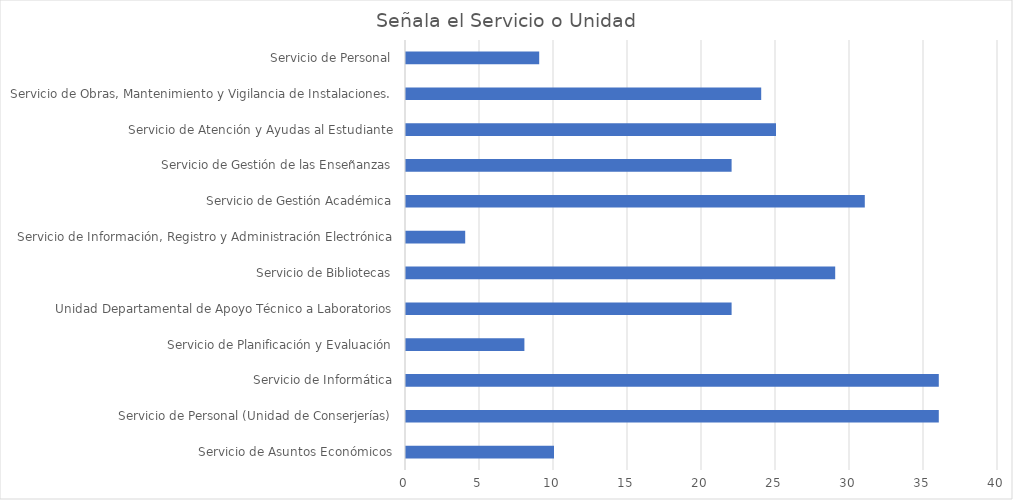
| Category | Series 4 |
|---|---|
| Servicio de Asuntos Económicos | 10 |
| Servicio de Personal (Unidad de Conserjerías) | 36 |
| Servicio de Informática | 36 |
| Servicio de Planificación y Evaluación | 8 |
| Unidad Departamental de Apoyo Técnico a Laboratorios | 22 |
| Servicio de Bibliotecas | 29 |
| Servicio de Información, Registro y Administración Electrónica | 4 |
| Servicio de Gestión Académica | 31 |
| Servicio de Gestión de las Enseñanzas | 22 |
| Servicio de Atención y Ayudas al Estudiante | 25 |
| Servicio de Obras, Mantenimiento y Vigilancia de Instalaciones. | 24 |
| Servicio de Personal | 9 |